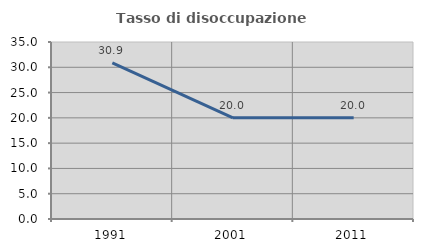
| Category | Tasso di disoccupazione giovanile  |
|---|---|
| 1991.0 | 30.882 |
| 2001.0 | 20 |
| 2011.0 | 20 |